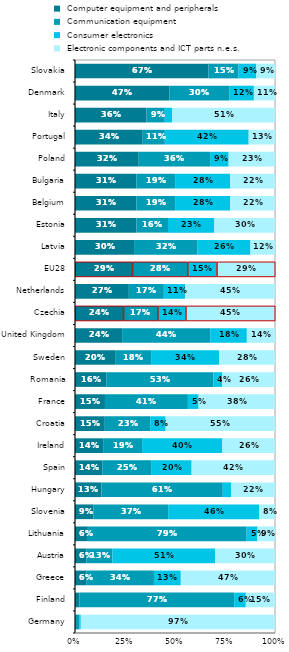
| Category |  Computer equipment and peripherals |  Communication equipment |  Consumer electronics |  Electronic components and ICT parts n.e.s. |
|---|---|---|---|---|
| Germany | 0.004 | 0.017 | 0.008 | 0.971 |
| Finland | 0.022 | 0.773 | 0.058 | 0.146 |
| Greece | 0.056 | 0.339 | 0.134 | 0.471 |
| Austria | 0.058 | 0.13 | 0.514 | 0.299 |
| Lithuania | 0.064 | 0.794 | 0.054 | 0.088 |
| Slovenia | 0.092 | 0.374 | 0.455 | 0.079 |
| Hungary | 0.132 | 0.606 | 0.041 | 0.22 |
| Spain | 0.138 | 0.245 | 0.2 | 0.417 |
| Ireland | 0.141 | 0.195 | 0.401 | 0.263 |
| Croatia | 0.149 | 0.227 | 0.077 | 0.547 |
| France | 0.15 | 0.415 | 0.054 | 0.382 |
| Romania | 0.158 | 0.534 | 0.044 | 0.264 |
| Sweden | 0.204 | 0.177 | 0.34 | 0.28 |
| United Kingdom | 0.236 | 0.44 | 0.183 | 0.141 |
| Czechia | 0.242 | 0.171 | 0.141 | 0.446 |
| Netherlands | 0.269 | 0.175 | 0.106 | 0.45 |
| EU28 | 0.287 | 0.275 | 0.146 | 0.291 |
| Latvia | 0.295 | 0.317 | 0.265 | 0.123 |
| Estonia | 0.307 | 0.158 | 0.232 | 0.303 |
| Belgium | 0.307 | 0.193 | 0.276 | 0.224 |
| Bulgaria | 0.307 | 0.193 | 0.276 | 0.224 |
| Poland | 0.319 | 0.357 | 0.093 | 0.232 |
| Portugal | 0.339 | 0.11 | 0.419 | 0.132 |
| Italy | 0.358 | 0.091 | 0.038 | 0.513 |
| Denmark | 0.472 | 0.302 | 0.121 | 0.106 |
| Slovakia | 0.668 | 0.15 | 0.087 | 0.095 |